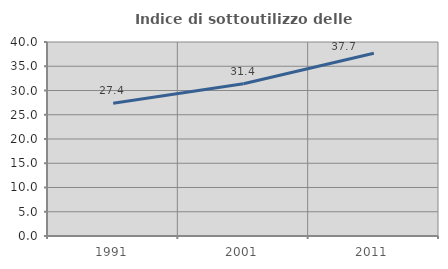
| Category | Indice di sottoutilizzo delle abitazioni  |
|---|---|
| 1991.0 | 27.372 |
| 2001.0 | 31.387 |
| 2011.0 | 37.68 |